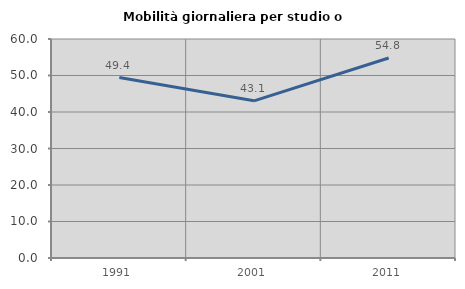
| Category | Mobilità giornaliera per studio o lavoro |
|---|---|
| 1991.0 | 49.444 |
| 2001.0 | 43.06 |
| 2011.0 | 54.792 |